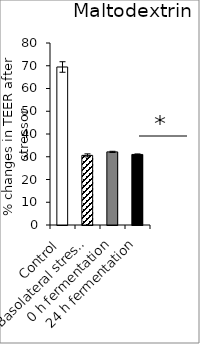
| Category | average |
|---|---|
| Control | 69.455 |
| Basolateral stressor | 30.606 |
| 0 h fermentation | 32.139 |
| 24 h fermentation | 31.012 |